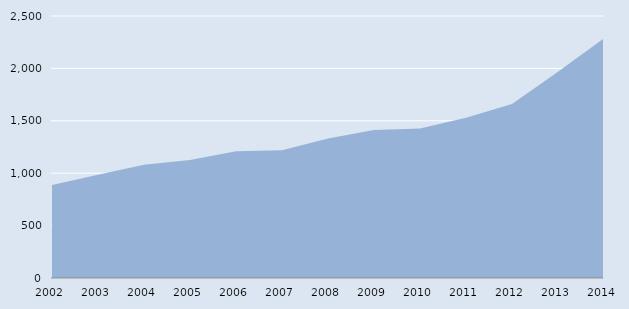
| Category | Series 0 |
|---|---|
| 2002.0 | 888 |
| 2003.0 | 986 |
| 2004.0 | 1081 |
| 2005.0 | 1125 |
| 2006.0 | 1210 |
| 2007.0 | 1220 |
| 2008.0 | 1332 |
| 2009.0 | 1413 |
| 2010.0 | 1427 |
| 2011.0 | 1530 |
| 2012.0 | 1660 |
| 2013.0 | 1969 |
| 2014.0 | 2288 |